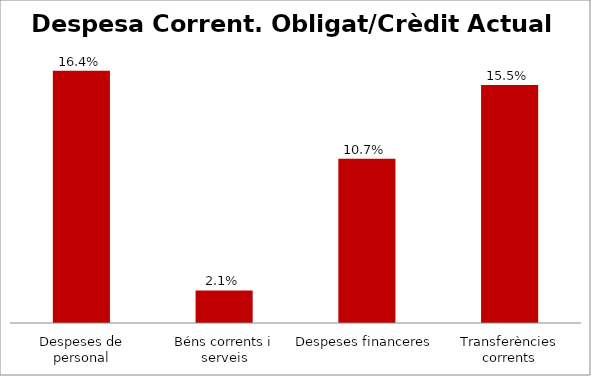
| Category | Series 0 |
|---|---|
| Despeses de personal | 0.164 |
| Béns corrents i serveis | 0.021 |
| Despeses financeres | 0.107 |
| Transferències corrents | 0.155 |